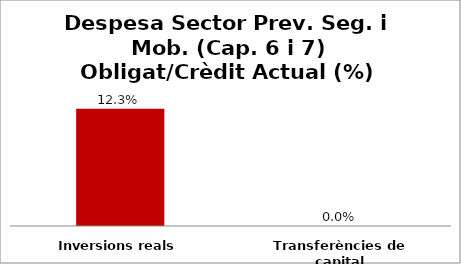
| Category | Series 0 |
|---|---|
| Inversions reals | 0.123 |
| Transferències de capital | 0 |